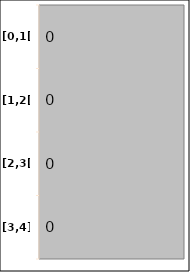
| Category | Series 0 |
|---|---|
| [0,1[ | 0 |
| [1,2[ | 0 |
| [2,3[ | 0 |
| [3,4] | 0 |